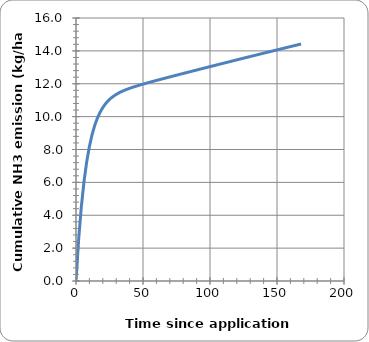
| Category | Series 0 |
|---|---|
| 0.0 | 0 |
| 2.0 | 2.558 |
| 4.0 | 4.536 |
| 6.0 | 6.069 |
| 8.0 | 7.259 |
| 10.0 | 8.184 |
| 12.0 | 8.907 |
| 14.0 | 9.473 |
| 16.0 | 9.918 |
| 18.0 | 10.271 |
| 20.0 | 10.553 |
| 22.0 | 10.78 |
| 24.0 | 10.964 |
| 26.0 | 11.116 |
| 28.0 | 11.243 |
| 30.0 | 11.35 |
| 32.0 | 11.443 |
| 34.0 | 11.524 |
| 36.0 | 11.596 |
| 38.0 | 11.661 |
| 40.0 | 11.722 |
| 42.0 | 11.778 |
| 48.0 | 11.93 |
| 54.0 | 12.069 |
| 60.0 | 12.201 |
| 66.0 | 12.33 |
| 72.0 | 12.457 |
| 78.0 | 12.584 |
| 84.0 | 12.709 |
| 90.0 | 12.834 |
| 96.0 | 12.959 |
| 102.0 | 13.083 |
| 108.0 | 13.207 |
| 114.0 | 13.33 |
| 120.0 | 13.452 |
| 126.0 | 13.575 |
| 132.0 | 13.697 |
| 138.0 | 13.818 |
| 144.0 | 13.939 |
| 150.0 | 14.06 |
| 156.0 | 14.18 |
| 162.0 | 14.299 |
| 168.0 | 14.419 |